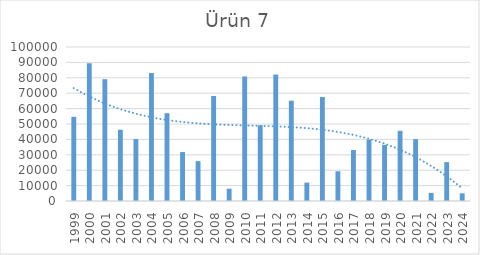
| Category | Ürün 7 |
|---|---|
| 1999.0 | 54657 |
| 2000.0 | 89476 |
| 2001.0 | 79084 |
| 2002.0 | 46294 |
| 2003.0 | 40230 |
| 2004.0 | 83146 |
| 2005.0 | 57037 |
| 2006.0 | 31786 |
| 2007.0 | 25889 |
| 2008.0 | 68206 |
| 2009.0 | 7956 |
| 2010.0 | 80867 |
| 2011.0 | 49197 |
| 2012.0 | 82090 |
| 2013.0 | 65156 |
| 2014.0 | 11945 |
| 2015.0 | 67561 |
| 2016.0 | 19325 |
| 2017.0 | 33077 |
| 2018.0 | 39847 |
| 2019.0 | 36445 |
| 2020.0 | 45559 |
| 2021.0 | 40178 |
| 2022.0 | 5249 |
| 2023.0 | 25244 |
| 2024.0 | 5001 |